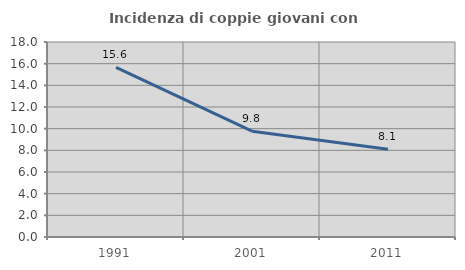
| Category | Incidenza di coppie giovani con figli |
|---|---|
| 1991.0 | 15.65 |
| 2001.0 | 9.768 |
| 2011.0 | 8.094 |